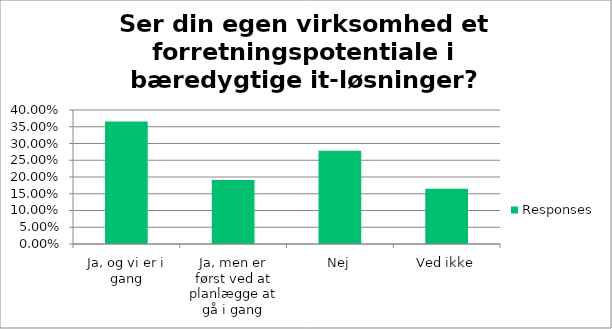
| Category | Responses |
|---|---|
| Ja, og vi er i gang | 0.366 |
| Ja, men er først ved at planlægge at gå i gang | 0.191 |
| Nej | 0.278 |
| Ved ikke | 0.165 |